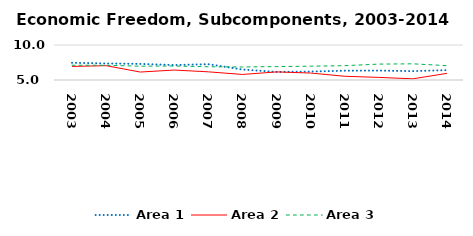
| Category | Area 1 | Area 2 | Area 3 |
|---|---|---|---|
| 2003.0 | 7.457 | 6.937 | 7.111 |
| 2004.0 | 7.362 | 7.047 | 7.104 |
| 2005.0 | 7.3 | 6.137 | 6.976 |
| 2006.0 | 7.136 | 6.422 | 7 |
| 2007.0 | 7.259 | 6.167 | 6.893 |
| 2008.0 | 6.497 | 5.792 | 6.861 |
| 2009.0 | 6.153 | 6.156 | 6.918 |
| 2010.0 | 6.205 | 5.994 | 6.972 |
| 2011.0 | 6.33 | 5.532 | 7.046 |
| 2012.0 | 6.345 | 5.371 | 7.272 |
| 2013.0 | 6.266 | 5.169 | 7.31 |
| 2014.0 | 6.41 | 5.947 | 7.05 |